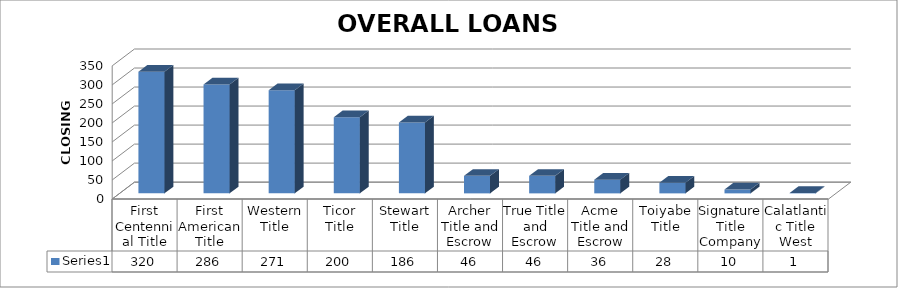
| Category | Series 0 |
|---|---|
| First Centennial Title | 320 |
| First American Title | 286 |
| Western Title | 271 |
| Ticor Title | 200 |
| Stewart Title | 186 |
| Archer Title and Escrow | 46 |
| True Title and Escrow | 46 |
| Acme Title and Escrow | 36 |
| Toiyabe Title | 28 |
| Signature Title Company | 10 |
| Calatlantic Title West | 1 |